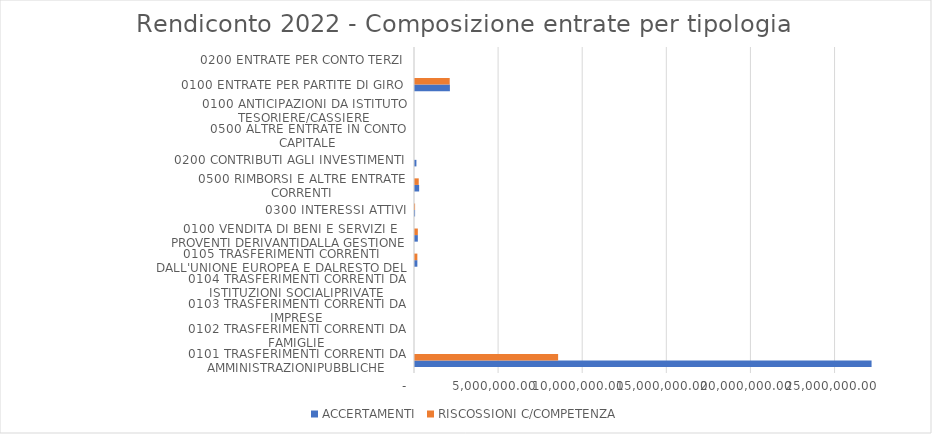
| Category | ACCERTAMENTI | RISCOSSIONI C/COMPETENZA |
|---|---|---|
| 0101 TRASFERIMENTI CORRENTI DA AMMINISTRAZIONIPUBBLICHE | 27142236.76 | 8508000 |
| 0102 TRASFERIMENTI CORRENTI DA FAMIGLIE | 0 | 0 |
| 0103 TRASFERIMENTI CORRENTI DA IMPRESE | 0 | 0 |
| 0104 TRASFERIMENTI CORRENTI DA ISTITUZIONI SOCIALIPRIVATE | 0 | 0 |
| 0105 TRASFERIMENTI CORRENTI DALL'UNIONE EUROPEA E DALRESTO DEL MONDO | 140153.31 | 140153.31 |
| 0100 VENDITA DI BENI E SERVIZI E PROVENTI DERIVANTIDALLA GESTIONE DEI BENI | 168698.27 | 168698.27 |
| 0300 INTERESSI ATTIVI | 5145.58 | 5145.58 |
| 0500 RIMBORSI E ALTRE ENTRATE CORRENTI | 246431.95 | 222110.84 |
| 0200 CONTRIBUTI AGLI INVESTIMENTI | 84083.62 | 0 |
| 0500 ALTRE ENTRATE IN CONTO CAPITALE | 0 | 0 |
| 0100 ANTICIPAZIONI DA ISTITUTO TESORIERE/CASSIERE | 0 | 0 |
| 0100 ENTRATE PER PARTITE DI GIRO | 2074266.91 | 2063385.89 |
| 0200 ENTRATE PER CONTO TERZI | 0 | 0 |